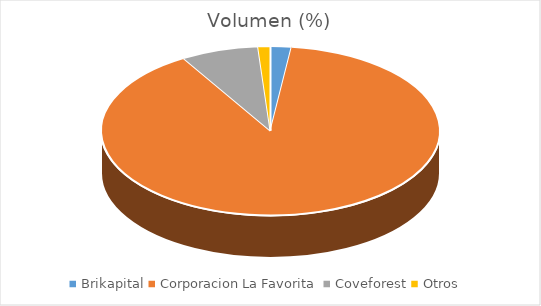
| Category | Volumen |
|---|---|
| Brikapital | 7000 |
| Corporacion La Favorita | 312752.04 |
| Coveforest | 25981.8 |
| Otros | 4100 |